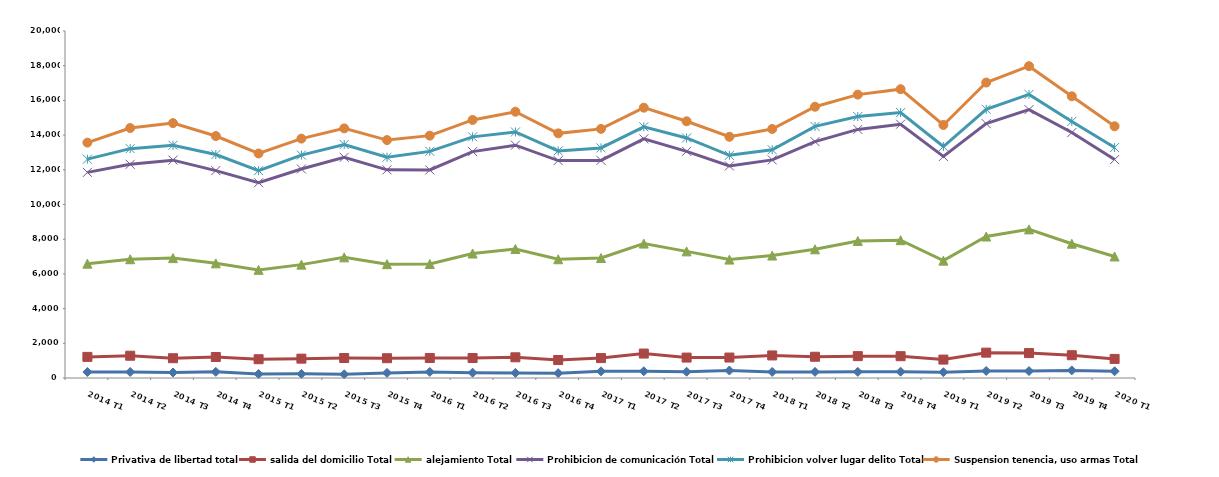
| Category | Privativa de libertad total | salida del domicilio Total | alejamiento Total | Prohibicion de comunicación Total | Prohibicion volver lugar delito Total | Suspension tenencia, uso armas Total |
|---|---|---|---|---|---|---|
| 2014 T1 | 344 | 873 | 5372 | 5264 | 760 | 953 |
| 2014 T2 | 347 | 937 | 5561 | 5471 | 903 | 1189 |
| 2014 T3 | 317 | 824 | 5769 | 5646 | 860 | 1275 |
| 2014 T4 | 355 | 855 | 5398 | 5347 | 923 | 1068 |
| 2015 T1 | 229 | 853 | 5150 | 5026 | 695 | 988 |
| 2015 T2 | 238 | 877 | 5419 | 5513 | 802 | 948 |
| 2015 T3 | 216 | 937 | 5800 | 5766 | 739 | 929 |
| 2015 T4 | 295 | 846 | 5420 | 5437 | 727 | 988 |
| 2016 T1 | 351 | 803 | 5416 | 5420 | 1072 | 908 |
| 2016 T2 | 306 | 846 | 6022 | 5873 | 852 | 975 |
| 2016 T3 | 295 | 898 | 6241 | 5985 | 762 | 1166 |
| 2016 T4 | 280 | 757 | 5807 | 5686 | 560 | 1010 |
| 2017 T1 | 385 | 763 | 5769 | 5625 | 720 | 1097 |
| 2017 T2 | 389 | 1020 | 6337 | 6036 | 695 | 1103 |
| 2017 T3 | 360 | 817 | 6122 | 5765 | 770 | 963 |
| 2017 T4 | 432 | 747 | 5646 | 5399 | 610 | 1069 |
| 2018 T1 | 350 | 950 | 5758 | 5513 | 585 | 1196 |
| 2018 T2 | 352 | 872 | 6194 | 6206 | 877 | 1133 |
| 2018 T3 | 354 | 906 | 6638 | 6430 | 743 | 1263 |
| 2018 T4 | 364 | 894 | 6685 | 6685 | 670 | 1349 |
| 2019 T1 | 334 | 727 | 5704 | 6003 | 573 | 1243 |
| 2019 T2 | 406 | 1055 | 6694 | 6504 | 827 | 1543 |
| 2019 T3 | 401 | 1035 | 7130 | 6902 | 880 | 1624 |
| 2019 T4 | 437 | 876 | 6426 | 6409 | 640 | 1450 |
| 2020 T1 | 387 | 713 | 5904 | 5586 | 692 | 1228 |